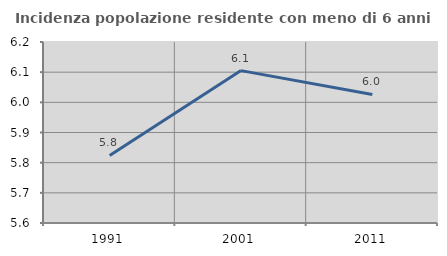
| Category | Incidenza popolazione residente con meno di 6 anni |
|---|---|
| 1991.0 | 5.824 |
| 2001.0 | 6.105 |
| 2011.0 | 6.026 |